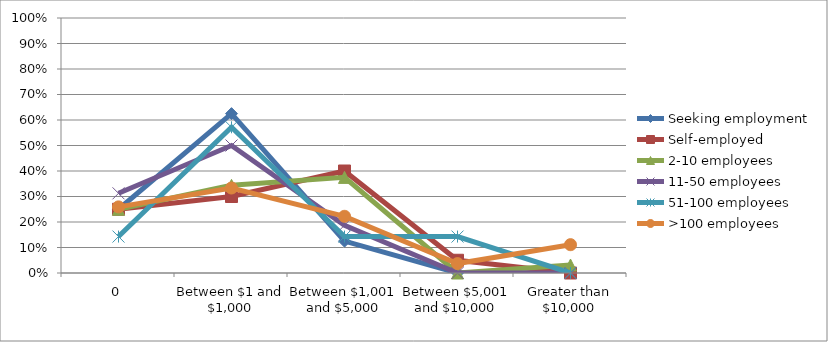
| Category | Seeking employment | Self-employed | 2-10 employees | 11-50 employees | 51-100 employees | >100 employees |
|---|---|---|---|---|---|---|
| 0 | 0.25 | 0.25 | 0.25 | 0.312 | 0.143 | 0.259 |
| Between $1 and $1,000 | 0.625 | 0.3 | 0.344 | 0.5 | 0.571 | 0.333 |
| Between $1,001 and $5,000 | 0.125 | 0.4 | 0.375 | 0.188 | 0.143 | 0.222 |
| Between $5,001 and $10,000 | 0 | 0.05 | 0 | 0 | 0.143 | 0.037 |
| Greater than $10,000 | 0 | 0 | 0.031 | 0 | 0 | 0.111 |